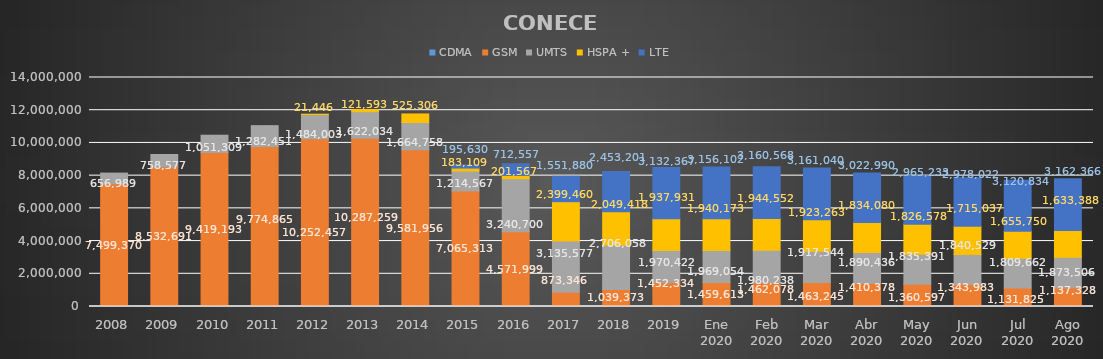
| Category | CDMA | GSM | UMTS | HSPA + | LTE |
|---|---|---|---|---|---|
| 2008 | 0 | 7499370 | 656989 | 0 | 0 |
| 2009 | 0 | 8532691 | 758577 | 0 | 0 |
| 2010 | 0 | 9419193 | 1051309 | 0 | 0 |
| 2011 | 0 | 9774865 | 1282451 | 0 | 0 |
| 2012 | 0 | 10252457 | 1484003 | 21446 | 0 |
| 2013 | 0 | 10287259 | 1622034 | 121593 | 0 |
| 2014 | 0 | 9581956 | 1664758 | 525306 | 0 |
| 2015 | 0 | 7065313 | 1214567 | 183109 | 195630 |
| 2016 | 0 | 4571999 | 3240700 | 201567 | 712557 |
| 2017 | 0 | 873346 | 3135577 | 2399460 | 1551880 |
| 2018 | 0 | 1039373 | 2706058 | 2049418 | 2453201 |
| 2019 | 0 | 1452334 | 1970422 | 1937931 | 3132367 |
| Ene 2020 | 0 | 1459613 | 1969054 | 1940173 | 3156102 |
| Feb 2020 | 0 | 1462078 | 1980238 | 1944552 | 3160568 |
| Mar 2020 | 0 | 1463245 | 1917544 | 1923263 | 3161040 |
| Abr 2020 | 0 | 1410378 | 1890436 | 1834080 | 3022990 |
| May 2020 | 0 | 1360597 | 1835391 | 1826578 | 2965233 |
| Jun 2020 | 0 | 1343983 | 1840529 | 1715037 | 2978022 |
| Jul 2020 | 0 | 1131825 | 1809662 | 1655750 | 3120834 |
| Ago 2020 | 0 | 1137328 | 1873506 | 1633388 | 3162366 |